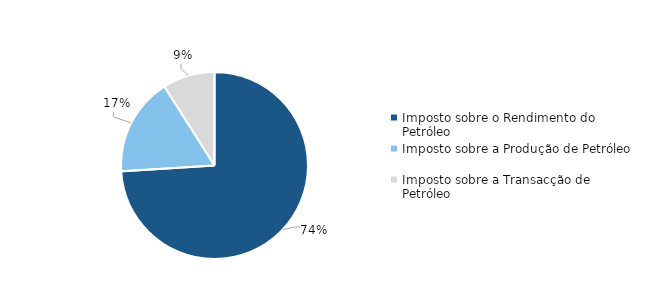
| Category | Peso s/ receita petrolífera |
|---|---|
| Imposto sobre o Rendimento do Petróleo | 0.74 |
| Imposto sobre a Produção de Petróleo | 0.17 |
| Imposto sobre a Transacção de Petróleo | 0.09 |